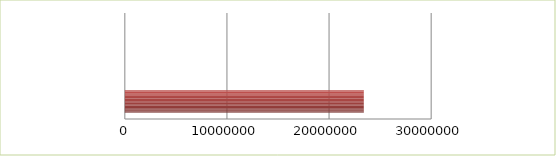
| Category | Series 0 | Series 1 |
|---|---|---|
| 0 | 2.5 | 23402325.98 |
| 1 | 2.6 | 0 |
| 2 | 2.7 | 0 |